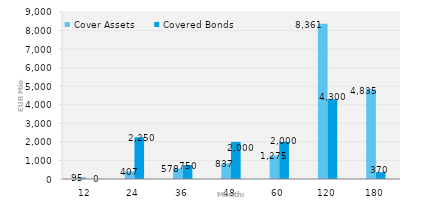
| Category | Cover Assets | Covered Bonds |
|---|---|---|
| 12.0 | 94.512 | 0 |
| 24.0 | 407.198 | 2250 |
| 36.0 | 577.933 | 750 |
| 48.0 | 837.336 | 2000 |
| 60.0 | 1274.556 | 2000 |
| 120.0 | 8361.274 | 4300 |
| 180.0 | 4835.32 | 370 |